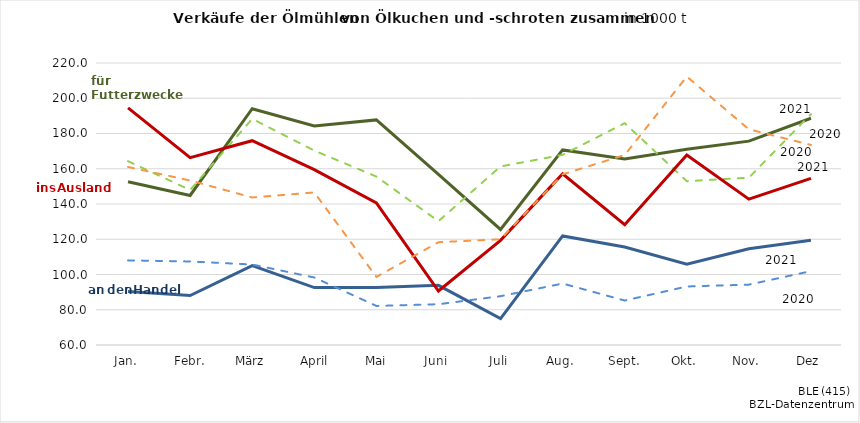
| Category | Series 0 | Series 1 | Series 2 | Series 3 | Series 4 | Series 5 |
|---|---|---|---|---|---|---|
| Jan. | 152.61 | 164.282 | 90.352 | 108.015 | 194.584 | 161.002 |
|  Febr. | 144.83 | 147.95 | 88.091 | 107.394 | 166.328 | 153.328 |
| März | 194.081 | 188.322 | 105 | 105.668 | 175.917 | 143.7 |
|  April | 184.31 | 170.298 | 92.581 | 98.301 | 159.529 | 146.572 |
|  Mai | 187.704 | 155.576 | 92.595 | 82.168 | 140.678 | 98.617 |
| Juni | 156.768 | 130.24 | 93.834 | 83.127 | 90.63 | 118.332 |
| Juli | 125.563 | 161.3 | 75.001 | 87.699 | 119.381 | 119.983 |
| Aug. | 170.677 | 167.89 | 121.886 | 94.871 | 157.109 | 156.83 |
|  Sept. | 165.475 | 185.854 | 115.608 | 85.234 | 128.244 | 167.799 |
| Okt. | 171.105 | 152.94 | 105.818 | 93.193 | 167.833 | 212.29 |
| Nov. | 175.677 | 154.945 | 114.624 | 94.256 | 142.75 | 182.375 |
| Dez | 188.663 | 190.973 | 119.382 | 101.906 | 154.526 | 173.508 |